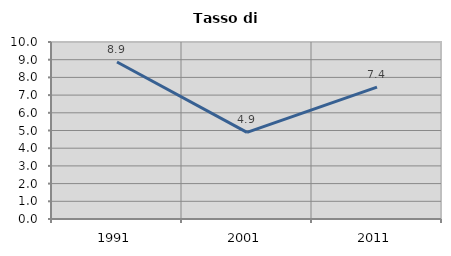
| Category | Tasso di disoccupazione   |
|---|---|
| 1991.0 | 8.869 |
| 2001.0 | 4.895 |
| 2011.0 | 7.45 |